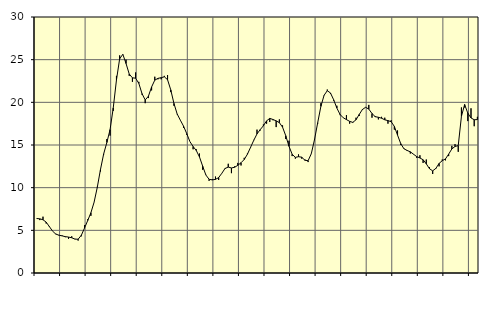
| Category | Piggar | Series 1 |
|---|---|---|
| nan | 6.4 | 6.39 |
| 87.0 | 6.2 | 6.35 |
| 87.0 | 6.6 | 6.24 |
| 87.0 | 5.8 | 5.96 |
| nan | 5.5 | 5.44 |
| 88.0 | 4.9 | 4.91 |
| 88.0 | 4.6 | 4.56 |
| 88.0 | 4.4 | 4.43 |
| nan | 4.4 | 4.35 |
| 89.0 | 4.2 | 4.26 |
| 89.0 | 4 | 4.21 |
| 89.0 | 4.3 | 4.13 |
| nan | 4 | 3.97 |
| 90.0 | 3.8 | 3.96 |
| 90.0 | 4.3 | 4.42 |
| 90.0 | 5.6 | 5.26 |
| nan | 6.3 | 6.15 |
| 91.0 | 6.7 | 7.06 |
| 91.0 | 8.3 | 8.29 |
| 91.0 | 10.1 | 10.04 |
| nan | 11.9 | 12.13 |
| 92.0 | 13.9 | 13.96 |
| 92.0 | 15.7 | 15.3 |
| 92.0 | 16.1 | 16.8 |
| nan | 19 | 19.35 |
| 93.0 | 23.1 | 22.62 |
| 93.0 | 25.5 | 25.1 |
| 93.0 | 25.6 | 25.63 |
| nan | 25 | 24.55 |
| 94.0 | 23.1 | 23.32 |
| 94.0 | 22.4 | 22.87 |
| 94.0 | 23.5 | 22.83 |
| nan | 22.4 | 22.22 |
| 95.0 | 20.9 | 21.02 |
| 95.0 | 19.9 | 20.28 |
| 95.0 | 20.5 | 20.71 |
| nan | 21.4 | 21.8 |
| 96.0 | 23 | 22.6 |
| 96.0 | 22.7 | 22.81 |
| 96.0 | 22.7 | 22.89 |
| nan | 23.1 | 22.99 |
| 97.0 | 23.2 | 22.65 |
| 97.0 | 21.2 | 21.46 |
| 97.0 | 19.6 | 19.87 |
| nan | 18.6 | 18.64 |
| 98.0 | 17.9 | 17.91 |
| 98.0 | 17 | 17.21 |
| 98.0 | 16.2 | 16.34 |
| nan | 15.4 | 15.4 |
| 99.0 | 14.5 | 14.82 |
| 99.0 | 14.5 | 14.35 |
| 99.0 | 14 | 13.59 |
| nan | 12.1 | 12.51 |
| 0.0 | 11.5 | 11.48 |
| 0.0 | 10.8 | 10.98 |
| 0.0 | 11 | 10.91 |
| nan | 11.3 | 10.97 |
| 1.0 | 10.9 | 11.18 |
| 1.0 | 11.7 | 11.69 |
| 1.0 | 12.2 | 12.25 |
| nan | 12.8 | 12.41 |
| 2.0 | 11.7 | 12.31 |
| 2.0 | 12.5 | 12.39 |
| 2.0 | 12.9 | 12.62 |
| nan | 12.6 | 12.92 |
| 3.0 | 13.5 | 13.3 |
| 3.0 | 14 | 13.92 |
| 3.0 | 14.7 | 14.74 |
| nan | 15.6 | 15.56 |
| 4.0 | 16.8 | 16.3 |
| 4.0 | 16.7 | 16.8 |
| 4.0 | 17.4 | 17.25 |
| nan | 17.5 | 17.83 |
| 5.0 | 17.7 | 18.12 |
| 5.0 | 17.9 | 17.99 |
| 5.0 | 17.1 | 17.83 |
| nan | 18 | 17.62 |
| 6.0 | 17.3 | 17.09 |
| 6.0 | 15.7 | 16.09 |
| 6.0 | 15.5 | 14.86 |
| nan | 13.7 | 13.92 |
| 7.0 | 13.4 | 13.55 |
| 7.0 | 13.9 | 13.63 |
| 7.0 | 13.4 | 13.57 |
| nan | 13.3 | 13.21 |
| 8.0 | 13 | 13.16 |
| 8.0 | 14 | 13.98 |
| 8.0 | 15.7 | 15.62 |
| nan | 17.5 | 17.61 |
| 9.0 | 19.9 | 19.53 |
| 9.0 | 20.8 | 20.83 |
| 9.0 | 21.5 | 21.36 |
| nan | 21 | 21.1 |
| 10.0 | 20.2 | 20.3 |
| 10.0 | 19.6 | 19.33 |
| 10.0 | 18.5 | 18.58 |
| nan | 18.2 | 18.19 |
| 11.0 | 18.5 | 17.98 |
| 11.0 | 17.5 | 17.77 |
| 11.0 | 17.6 | 17.65 |
| nan | 18.2 | 17.96 |
| 12.0 | 18.4 | 18.58 |
| 12.0 | 19.1 | 19.16 |
| 12.0 | 19.4 | 19.42 |
| nan | 19.7 | 19.21 |
| 13.0 | 18.2 | 18.69 |
| 13.0 | 18.4 | 18.32 |
| 13.0 | 18 | 18.25 |
| nan | 18.3 | 18.14 |
| 14.0 | 18.2 | 17.95 |
| 14.0 | 17.5 | 17.86 |
| 14.0 | 17.9 | 17.73 |
| nan | 16.8 | 17.18 |
| 15.0 | 16.7 | 16.16 |
| 15.0 | 15 | 15.16 |
| 15.0 | 14.6 | 14.56 |
| nan | 14.3 | 14.36 |
| 16.0 | 14 | 14.2 |
| 16.0 | 13.9 | 13.92 |
| 16.0 | 13.5 | 13.64 |
| nan | 13.8 | 13.48 |
| 17.0 | 12.9 | 13.27 |
| 17.0 | 13.3 | 12.79 |
| 17.0 | 12.4 | 12.22 |
| nan | 11.6 | 11.97 |
| 18.0 | 12.2 | 12.26 |
| 18.0 | 12.5 | 12.84 |
| 18.0 | 13.3 | 13.16 |
| nan | 13.2 | 13.37 |
| 19.0 | 13.7 | 13.93 |
| 19.0 | 14.9 | 14.54 |
| 19.0 | 15.1 | 14.83 |
| nan | 14.2 | 14.93 |
| 20.0 | 19.4 | 18.36 |
| 20.0 | 19.4 | 19.74 |
| 20.0 | 17.8 | 18.73 |
| nan | 19.3 | 18.17 |
| 21.0 | 17.2 | 17.96 |
| 21.0 | 18.3 | 17.98 |